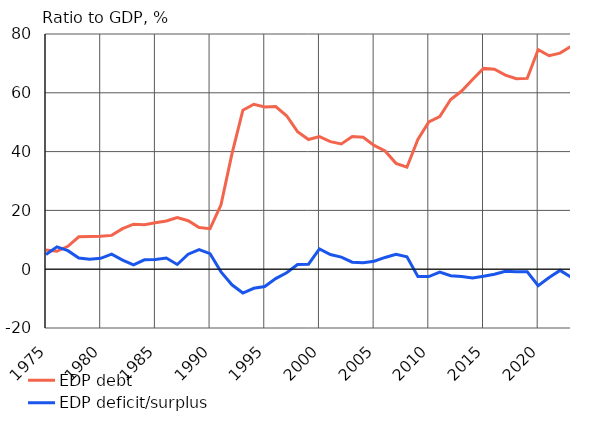
| Category | EDP debt | EDP deficit/surplus |
|---|---|---|
| 1975 | 6.5 | 5 |
| 1976 | 6.1 | 7.6 |
| 1977 | 7.8 | 6.3 |
| 1978 | 11 | 3.8 |
| 1979 | 11.1 | 3.4 |
| 1980 | 11.2 | 3.7 |
| 1981 | 11.5 | 5.1 |
| 1982 | 13.8 | 3.1 |
| 1983 | 15.3 | 1.5 |
| 1984 | 15.1 | 3.2 |
| 1985 | 15.8 | 3.3 |
| 1986 | 16.4 | 3.8 |
| 1987 | 17.6 | 1.6 |
| 1988 | 16.5 | 5.1 |
| 1989 | 14.2 | 6.7 |
| 1990 | 13.8 | 5.3 |
| 1991 | 21.9 | -0.9 |
| 1992 | 39.2 | -5.3 |
| 1993 | 54.1 | -8.1 |
| 1994 | 56.1 | -6.5 |
| 1995 | 55.2 | -5.9 |
| 1996 | 55.3 | -3.2 |
| 1997 | 52.2 | -1.2 |
| 1998 | 46.8 | 1.6 |
| 1999 | 44.1 | 1.7 |
| 2000 | 45.1 | 6.9 |
| 2001 | 43.4 | 5 |
| 2002 | 42.6 | 4.1 |
| 2003 | 45.1 | 2.4 |
| 2004 | 44.9 | 2.2 |
| 2005 | 42.1 | 2.7 |
| 2006 | 40.2 | 4 |
| 2007 | 36 | 5.1 |
| 2008 | 34.7 | 4.2 |
| 2009 | 44.1 | -2.5 |
| 2010 | 50.1 | -2.5 |
| 2011 | 51.9 | -1 |
| 2012 | 57.7 | -2.2 |
| 2013 | 60.6 | -2.5 |
| 2014 | 64.5 | -3 |
| 2015 | 68.3 | -2.4 |
| 2016 | 68 | -1.7 |
| 2017 | 66 | -0.7 |
| 2018 | 64.8 | -0.9 |
| 2019 | 64.9 | -0.9 |
| 2020 | 74.7 | -5.6 |
| 2021 | 72.6 | -2.8 |
| 2022* | 73.5 | -0.4 |
| 2023* | 75.8 | -2.7 |